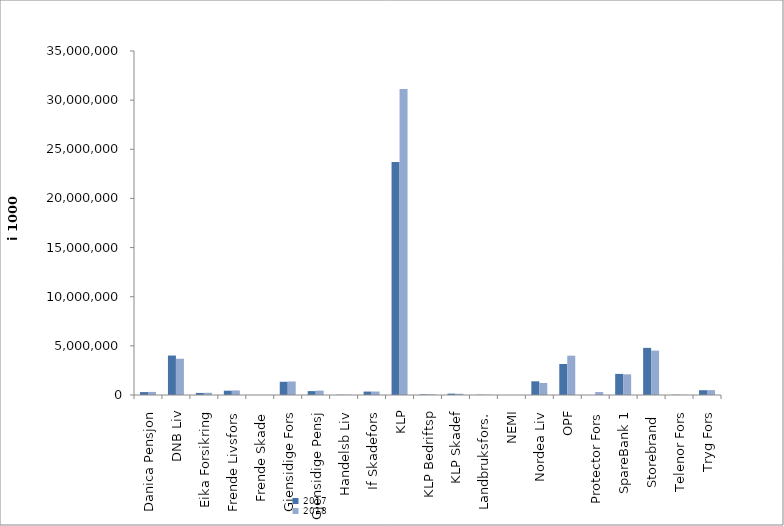
| Category | 2017 | 2018 |
|---|---|---|
| Danica Pensjon | 296945.323 | 311903.856 |
| DNB Liv | 4014341.293 | 3693482 |
| Eika Forsikring | 210802 | 228170 |
| Frende Livsfors | 437712.8 | 463177 |
| Frende Skade | 5631 | 6101 |
| Gjensidige Fors | 1345481 | 1376815 |
| Gjensidige Pensj | 397649.359 | 448350 |
| Handelsb Liv | 28772 | 27672 |
| If Skadefors | 349378.466 | 354933.206 |
| KLP | 23695892.482 | 31138078.291 |
| KLP Bedriftsp | 61324 | 66367 |
| KLP Skadef | 138577.387 | 126445.983 |
| Landbruksfors. | 24813 | 24377 |
| NEMI | 2011 | 1079 |
| Nordea Liv | 1392867.115 | 1223827.073 |
| OPF | 3152879 | 4003368.515 |
| Protector Fors | 0 | 299297.717 |
| SpareBank 1 | 2146555.902 | 2103059.959 |
| Storebrand  | 4796050.129 | 4517436.409 |
| Telenor Fors | 23751 | 20446 |
| Tryg Fors | 487718.421 | 494563 |